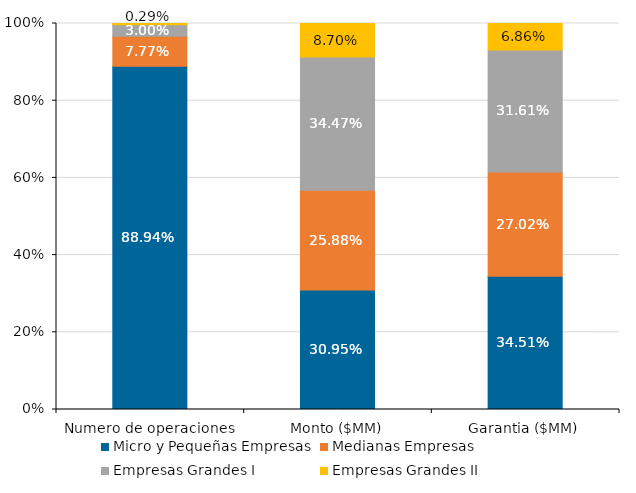
| Category | Micro y Pequeñas Empresas | Medianas Empresas | Empresas Grandes I | Empresas Grandes II |
|---|---|---|---|---|
| Numero de operaciones | 0.889 | 0.078 | 0.03 | 0.003 |
| Monto ($MM) | 0.31 | 0.259 | 0.345 | 0.087 |
| Garantia ($MM) | 0.345 | 0.27 | 0.316 | 0.069 |